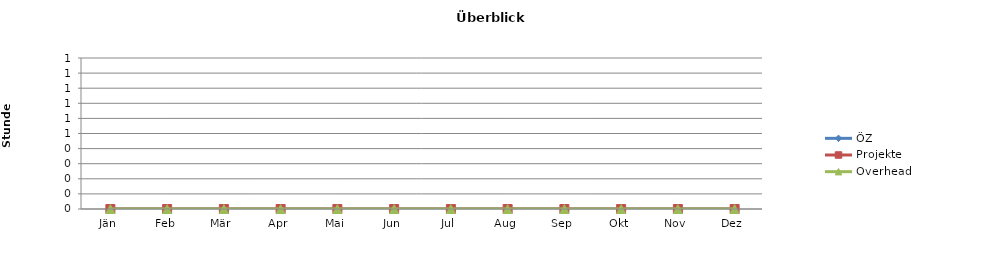
| Category | ÖZ | Projekte | Overhead |
|---|---|---|---|
| Jän | 0 | 0 | 0 |
| Feb | 0 | 0 | 0 |
| Mär | 0 | 0 | 0 |
| Apr | 0 | 0 | 0 |
| Mai | 0 | 0 | 0 |
| Jun | 0 | 0 | 0 |
| Jul | 0 | 0 | 0 |
| Aug | 0 | 0 | 0 |
| Sep | 0 | 0 | 0 |
| Okt | 0 | 0 | 0 |
| Nov | 0 | 0 | 0 |
| Dez | 0 | 0 | 0 |